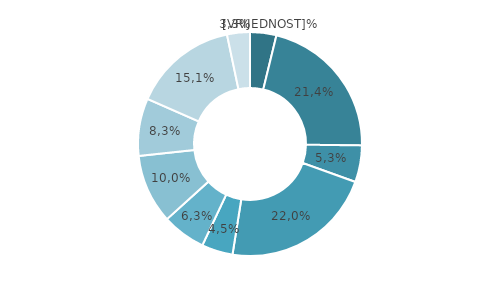
| Category | RH |
|---|---|
| A | 3.8 |
| B, C, D, E | 21.4 |
| F | 5.3 |
| G, H, I | 22 |
| J | 4.5 |
| K | 6.3 |
| L | 10 |
| M, N | 8.3 |
| O, P, Q | 15.1 |
| R, S, T, U | 3.3 |